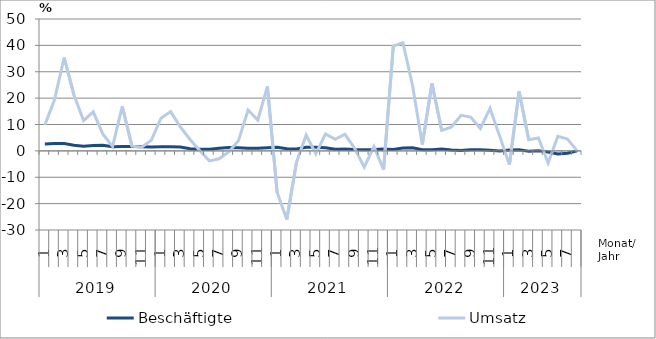
| Category | Beschäftigte | Umsatz |
|---|---|---|
| 0 | 2.6 | 9.8 |
| 1 | 2.8 | 19.4 |
| 2 | 2.8 | 35.4 |
| 3 | 2.1 | 21.3 |
| 4 | 1.8 | 11.5 |
| 5 | 2 | 14.8 |
| 6 | 2.1 | 6.3 |
| 7 | 1.6 | 1.7 |
| 8 | 1.7 | 16.9 |
| 9 | 1.7 | 1.8 |
| 10 | 1.6 | 1.4 |
| 11 | 1.5 | 4 |
| 12 | 1.6 | 12.4 |
| 13 | 1.6 | 14.9 |
| 14 | 1.5 | 9.1 |
| 15 | 0.8 | 4.3 |
| 16 | 0.6 | 0.1 |
| 17 | 0.6 | -3.8 |
| 18 | 1 | -3 |
| 19 | 1.3 | -0.4 |
| 20 | 1.2 | 3.8 |
| 21 | 1 | 15.5 |
| 22 | 1 | 11.7 |
| 23 | 1.2 | 24.4 |
| 24 | 1.4 | -15.8 |
| 25 | 0.8 | -26 |
| 26 | 0.7 | -4.3 |
| 27 | 1.4 | 6 |
| 28 | 1.4 | -1.1 |
| 29 | 1.2 | 6.4 |
| 30 | 0.6 | 4.4 |
| 31 | 0.7 | 6.3 |
| 32 | 0.5 | 1 |
| 33 | 0.4 | -6.2 |
| 34 | 0.5 | 1.6 |
| 35 | 0.7 | -7.1 |
| 36 | 0.5 | 39.7 |
| 37 | 1.1 | 41 |
| 38 | 1.2 | 24.6 |
| 39 | 0.4 | 2.4 |
| 40 | 0.4 | 25.6 |
| 41 | 0.7 | 7.8 |
| 42 | 0.3 | 9 |
| 43 | 0.1 | 13.5 |
| 44 | 0.4 | 12.8 |
| 45 | 0.4 | 8.5 |
| 46 | 0.2 | 16.1 |
| 47 | 0 | 5.5 |
| 48 | 0.3 | -5.3 |
| 49 | 0.4 | 22.5 |
| 50 | -0.1 | 4.2 |
| 51 | 0 | 4.9 |
| 52 | -0.4 | -4.6 |
| 53 | -1.2 | 5.5 |
| 54 | -0.9 | 4.5 |
| 55 | 0 | 0 |